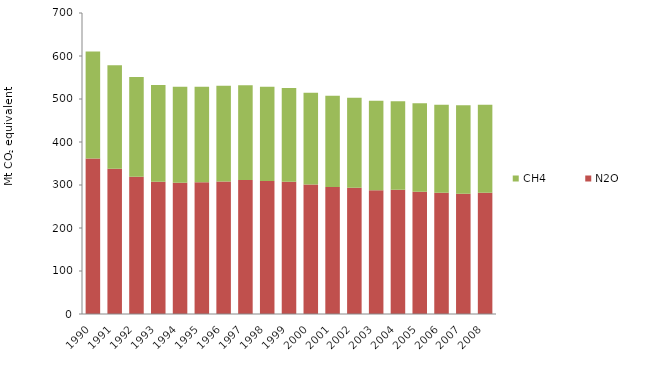
| Category | N2O | CH4 |
|---|---|---|
| 1990 | 361.397 | 249.063 |
| 1991 | 338.071 | 240.549 |
| 1992 | 319.225 | 231.819 |
| 1993 | 307.274 | 225.139 |
| 1994 | 305.476 | 223.021 |
| 1995 | 306.16 | 222.206 |
| 1996 | 307.946 | 222.585 |
| 1997 | 311.463 | 220.315 |
| 1998 | 309.08 | 219.537 |
| 1999 | 307.454 | 217.839 |
| 2000 | 301.102 | 213.636 |
| 2001 | 295.55 | 211.826 |
| 2002 | 293.379 | 209.519 |
| 2003 | 287.759 | 208.241 |
| 2004 | 288.982 | 205.718 |
| 2005 | 284.401 | 205.577 |
| 2006 | 281.749 | 204.843 |
| 2007 | 279.723 | 205.759 |
| 2008 | 282.002 | 204.807 |